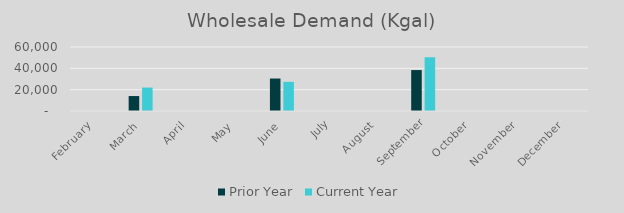
| Category | Prior Year | Current Year |
|---|---|---|
| February | 0 | 0 |
| March | 14013.78 | 21965.02 |
| April | 0 | 0 |
| May | 0 | 0 |
| June | 30443.6 | 27331 |
| July | 0 | 0 |
| August | 0 | 0 |
| September | 38376.14 | 50400.24 |
| October | 0 | 0 |
| November | 0 | 0 |
| December | 0 | 0 |